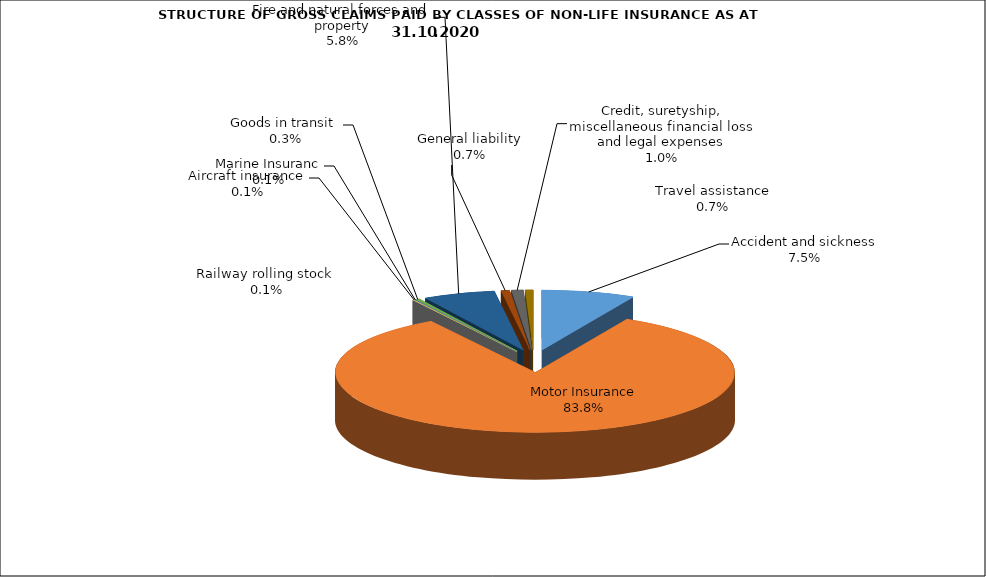
| Category | Accident and sickness | Series 1 |
|---|---|---|
| Accident and sickness | 0.075 |  |
| Motor Insurance | 0.838 |  |
| Railway rolling stock  | 0.001 |  |
| Aircraft insurance | 0.001 |  |
| Marine Insuranc | 0.001 |  |
| Goods in transit  | 0.003 |  |
| Fire and natural forces and property | 0.058 |  |
| General liability | 0.007 |  |
| Credit, suretyship, miscellaneous financial loss and legal expenses | 0.01 |  |
| Travel assistance | 0.007 |  |